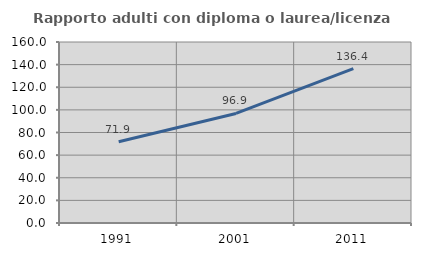
| Category | Rapporto adulti con diploma o laurea/licenza media  |
|---|---|
| 1991.0 | 71.89 |
| 2001.0 | 96.868 |
| 2011.0 | 136.398 |